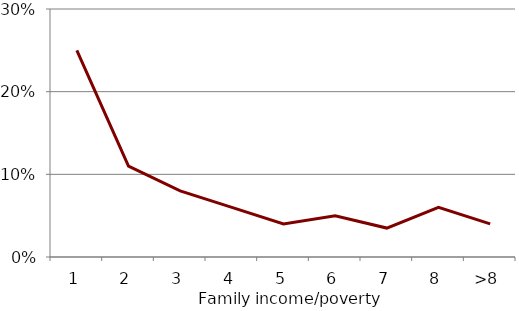
| Category | Series 0 |
|---|---|
| 1 | 0.25 |
| 2 | 0.11 |
| 3 | 0.08 |
| 4 | 0.06 |
| 5 | 0.04 |
| 6 | 0.05 |
| 7 | 0.035 |
| 8 | 0.06 |
| >8 | 0.04 |